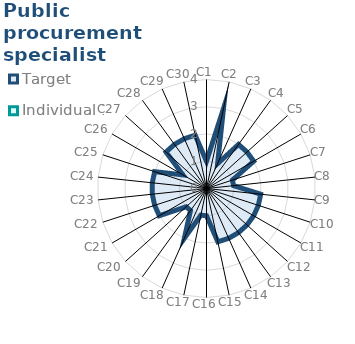
| Category | Target | Individual 1 |
|---|---|---|
| C1 | 1 | 0 |
| C2 | 3 | 0 |
| C3 | 1 | 0 |
| C4 | 2 | 0 |
| C5 | 2 | 0 |
| C6 | 2 | 0 |
| C7 | 1 | 0 |
| C8 | 1 | 0 |
| C9 | 2 | 0 |
| C10 | 2 | 0 |
| C11 | 2 | 0 |
| C12 | 2 | 0 |
| C13 | 2 | 0 |
| C14 | 2 | 0 |
| C15 | 2 | 0 |
| C16 | 1 | 0 |
| C17 | 1 | 0 |
| C18 | 2 | 0 |
| C19 | 1 | 0 |
| C20 | 1 | 0 |
| C21 | 2 | 0 |
| C22 | 2 | 0 |
| C23 | 2 | 0 |
| C24 | 2 | 0 |
| C25 | 2 | 0 |
| C26 | 1 | 0 |
| C27 | 2 | 0 |
| C28 | 2 | 0 |
| C29 | 2 | 0 |
| C30 | 2 | 0 |